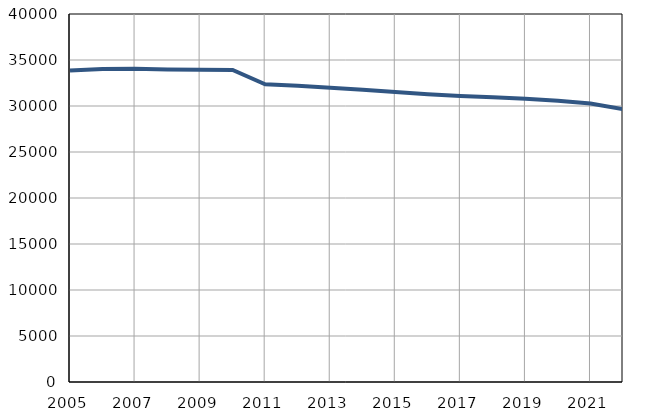
| Category | Број
становника |
|---|---|
| 2005.0 | 33847 |
| 2006.0 | 34016 |
| 2007.0 | 34062 |
| 2008.0 | 33966 |
| 2009.0 | 33931 |
| 2010.0 | 33913 |
| 2011.0 | 32353 |
| 2012.0 | 32197 |
| 2013.0 | 31988 |
| 2014.0 | 31759 |
| 2015.0 | 31510 |
| 2016.0 | 31269 |
| 2017.0 | 31091 |
| 2018.0 | 30939 |
| 2019.0 | 30795 |
| 2020.0 | 30575 |
| 2021.0 | 30268 |
| 2022.0 | 29648 |